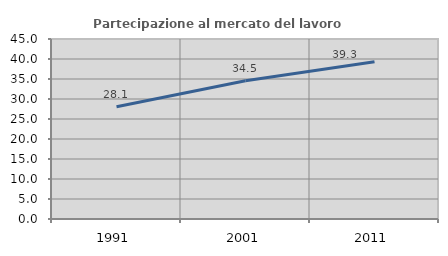
| Category | Partecipazione al mercato del lavoro  femminile |
|---|---|
| 1991.0 | 28.074 |
| 2001.0 | 34.546 |
| 2011.0 | 39.304 |